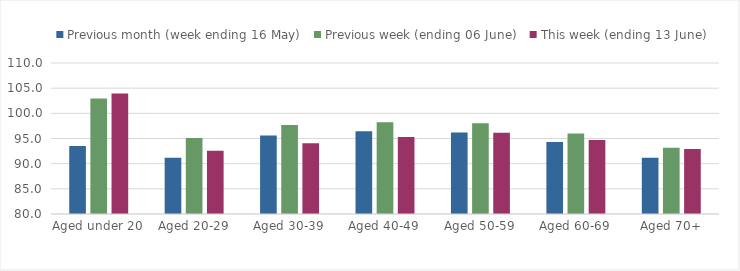
| Category | Previous month (week ending 16 May) | Previous week (ending 06 June) | This week (ending 13 June) |
|---|---|---|---|
| Aged under 20 | 93.519 | 102.933 | 103.934 |
| Aged 20-29 | 91.152 | 95.111 | 92.59 |
| Aged 30-39 | 95.573 | 97.664 | 94.04 |
| Aged 40-49 | 96.453 | 98.209 | 95.283 |
| Aged 50-59 | 96.204 | 98.027 | 96.141 |
| Aged 60-69 | 94.3 | 95.973 | 94.706 |
| Aged 70+ | 91.164 | 93.175 | 92.928 |